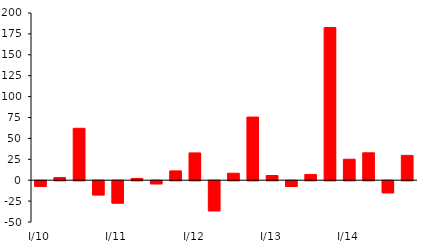
| Category | Series 1 |
|---|---|
| I/10 | -6.812 |
| II | 3.148 |
| III | 62.09 |
| IV | -17.001 |
| I/11 | -26.789 |
| II | 2.123 |
| III | -3.698 |
| IV | 11.134 |
| I/12 | 32.632 |
| II | -35.982 |
| III | 8.321 |
| IV | 75.502 |
| I/13 | 5.61 |
| II | -6.912 |
| III | 6.889 |
| IV | 182.604 |
| I/14 | 25.08 |
| II | 32.776 |
| III | -14.448 |
| IV | 29.714 |